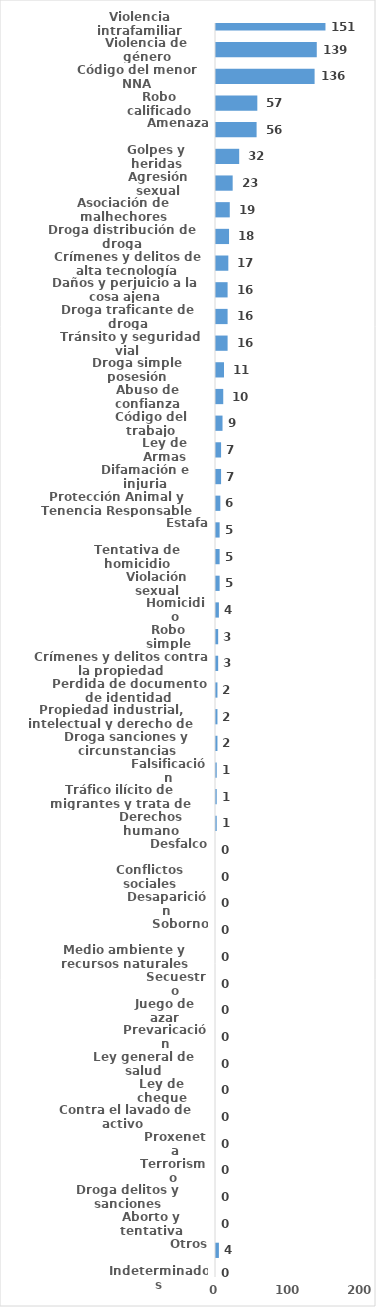
| Category | Series 0 |
|---|---|
| Violencia intrafamiliar | 151 |
| Violencia de género | 139 |
| Código del menor NNA | 136 |
| Robo calificado | 57 |
| Amenaza | 56 |
| Golpes y heridas | 32 |
| Agresión sexual | 23 |
| Asociación de malhechores | 19 |
| Droga distribución de droga | 18 |
| Crímenes y delitos de alta tecnología | 17 |
| Daños y perjuicio a la cosa ajena | 16 |
| Droga traficante de droga | 16 |
| Tránsito y seguridad vial  | 16 |
| Droga simple posesión | 11 |
| Abuso de confianza | 10 |
| Código del trabajo | 9 |
| Ley de Armas | 7 |
| Difamación e injuria | 7 |
| Protección Animal y Tenencia Responsable | 6 |
| Estafa | 5 |
| Tentativa de homicidio | 5 |
| Violación sexual | 5 |
| Homicidio | 4 |
| Robo simple | 3 |
| Crímenes y delitos contra la propiedad | 3 |
| Perdida de documento de identidad | 2 |
| Propiedad industrial, intelectual y derecho de autor | 2 |
| Droga sanciones y circunstancias agravantes | 2 |
| Falsificación | 1 |
| Tráfico ilícito de migrantes y trata de personas | 1 |
| Derechos humano | 1 |
| Desfalco | 0 |
| Conflictos sociales | 0 |
| Desaparición | 0 |
| Soborno | 0 |
| Medio ambiente y recursos naturales | 0 |
| Secuestro | 0 |
| Juego de azar | 0 |
| Prevaricación | 0 |
| Ley general de salud | 0 |
| Ley de cheque | 0 |
| Contra el lavado de activo  | 0 |
| Proxeneta | 0 |
| Terrorismo | 0 |
| Droga delitos y sanciones | 0 |
| Aborto y tentativa | 0 |
| Otros | 4 |
| Indeterminados | 0 |